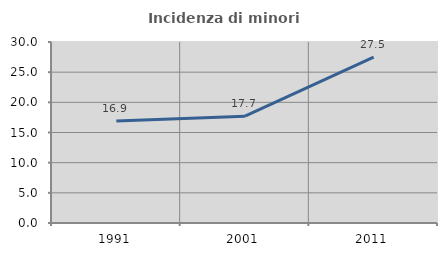
| Category | Incidenza di minori stranieri |
|---|---|
| 1991.0 | 16.901 |
| 2001.0 | 17.703 |
| 2011.0 | 27.477 |